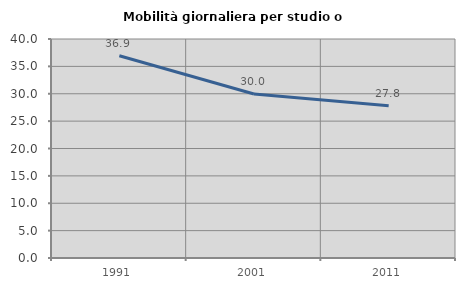
| Category | Mobilità giornaliera per studio o lavoro |
|---|---|
| 1991.0 | 36.943 |
| 2001.0 | 29.952 |
| 2011.0 | 27.82 |